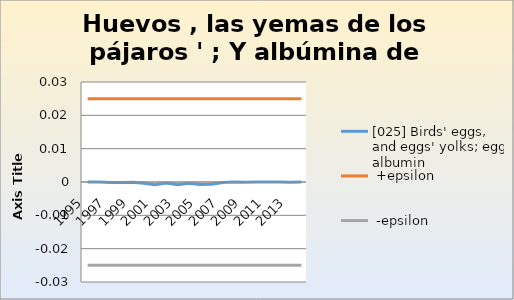
| Category | [025] Birds' eggs, and eggs' yolks; egg albumin |  +epsilon |  -epsilon |
|---|---|---|---|
| 1995.0 | 0 | 0.025 | -0.025 |
| 1996.0 | 0 | 0.025 | -0.025 |
| 1997.0 | 0 | 0.025 | -0.025 |
| 1998.0 | 0 | 0.025 | -0.025 |
| 1999.0 | 0 | 0.025 | -0.025 |
| 2000.0 | 0 | 0.025 | -0.025 |
| 2001.0 | -0.001 | 0.025 | -0.025 |
| 2002.0 | 0 | 0.025 | -0.025 |
| 2003.0 | -0.001 | 0.025 | -0.025 |
| 2004.0 | 0 | 0.025 | -0.025 |
| 2005.0 | -0.001 | 0.025 | -0.025 |
| 2006.0 | -0.001 | 0.025 | -0.025 |
| 2007.0 | 0 | 0.025 | -0.025 |
| 2008.0 | 0 | 0.025 | -0.025 |
| 2009.0 | 0 | 0.025 | -0.025 |
| 2010.0 | 0 | 0.025 | -0.025 |
| 2011.0 | 0 | 0.025 | -0.025 |
| 2012.0 | 0 | 0.025 | -0.025 |
| 2013.0 | 0 | 0.025 | -0.025 |
| 2014.0 | 0 | 0.025 | -0.025 |